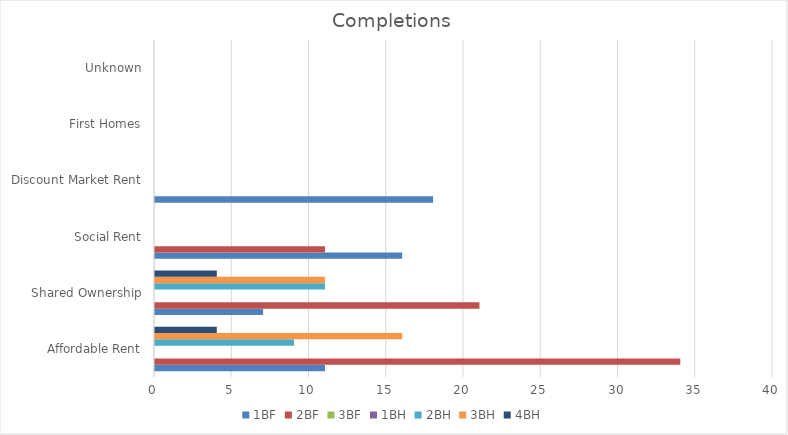
| Category | 1BF | 2BF | 3BF | 1BH | 2BH | 3BH | 4BH |
|---|---|---|---|---|---|---|---|
| Affordable Rent | 11 | 34 | 0 | 0 | 9 | 16 | 4 |
| Shared Ownership | 7 | 21 | 0 | 0 | 11 | 11 | 4 |
| Social Rent | 16 | 11 | 0 | 0 | 0 | 0 | 0 |
| Discount Market Rent | 18 | 0 | 0 | 0 | 0 | 0 | 0 |
| First Homes | 0 | 0 | 0 | 0 | 0 | 0 | 0 |
| Unknown | 0 | 0 | 0 | 0 | 0 | 0 | 0 |